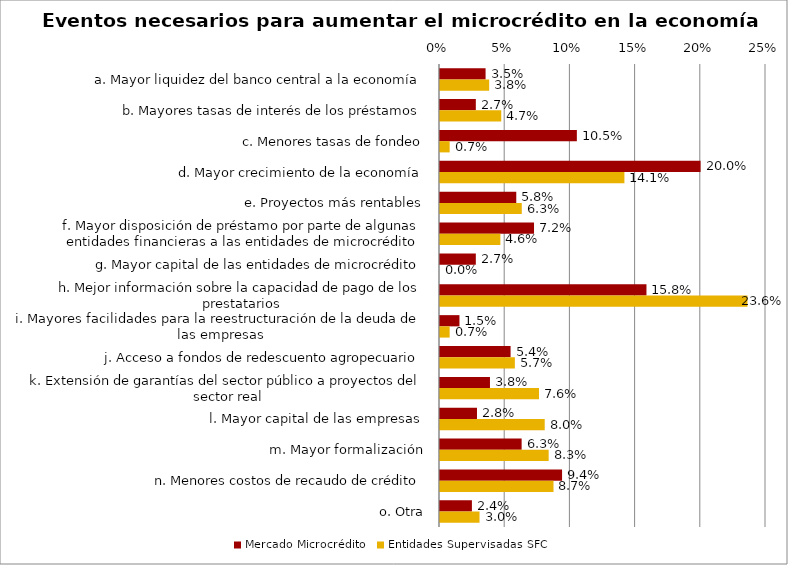
| Category | Mercado Microcrédito | Entidades Supervisadas SFC |
|---|---|---|
| a. Mayor liquidez del banco central a la economía | 0.035 | 0.038 |
| b. Mayores tasas de interés de los préstamos | 0.027 | 0.047 |
| c. Menores tasas de fondeo | 0.105 | 0.007 |
| d. Mayor crecimiento de la economía | 0.2 | 0.141 |
| e. Proyectos más rentables | 0.058 | 0.063 |
| f. Mayor disposición de préstamo por parte de algunas entidades financieras a las entidades de microcrédito | 0.072 | 0.046 |
| g. Mayor capital de las entidades de microcrédito | 0.027 | 0 |
| h. Mejor información sobre la capacidad de pago de los prestatarios | 0.158 | 0.236 |
| i. Mayores facilidades para la reestructuración de la deuda de las empresas | 0.015 | 0.007 |
| j. Acceso a fondos de redescuento agropecuario | 0.054 | 0.057 |
| k. Extensión de garantías del sector público a proyectos del sector real | 0.038 | 0.076 |
| l. Mayor capital de las empresas | 0.028 | 0.08 |
| m. Mayor formalización | 0.063 | 0.083 |
| n. Menores costos de recaudo de crédito | 0.094 | 0.087 |
| o. Otra | 0.024 | 0.03 |